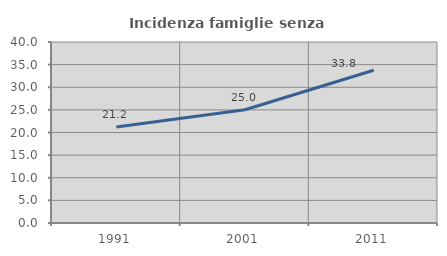
| Category | Incidenza famiglie senza nuclei |
|---|---|
| 1991.0 | 21.196 |
| 2001.0 | 25.026 |
| 2011.0 | 33.768 |